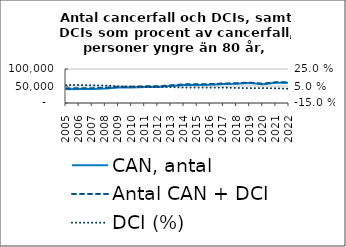
| Category | CAN, antal | Antal CAN + DCI |
|---|---|---|
| 2005.0 | 40588 | 43113 |
| 2006.0 | 41071 | 43637 |
| 2007.0 | 41267 | 43668 |
| 2008.0 | 42357 | 44682 |
| 2009.0 | 45223 | 47324 |
| 2010.0 | 45609 | 47512 |
| 2011.0 | 47335 | 49121 |
| 2012.0 | 47362 | 49151 |
| 2013.0 | 50148 | 51984 |
| 2014.0 | 53146 | 54853 |
| 2015.0 | 53268 | 54961 |
| 2016.0 | 54037 | 55716 |
| 2017.0 | 55640 | 57368 |
| 2018.0 | 56662 | 58224 |
| 2019.0 | 58545 | 59970 |
| 2020.0 | 55302 | 56702 |
| 2021.0 | 59755 | 61141 |
| 2022.0 | 59462 | 60482 |